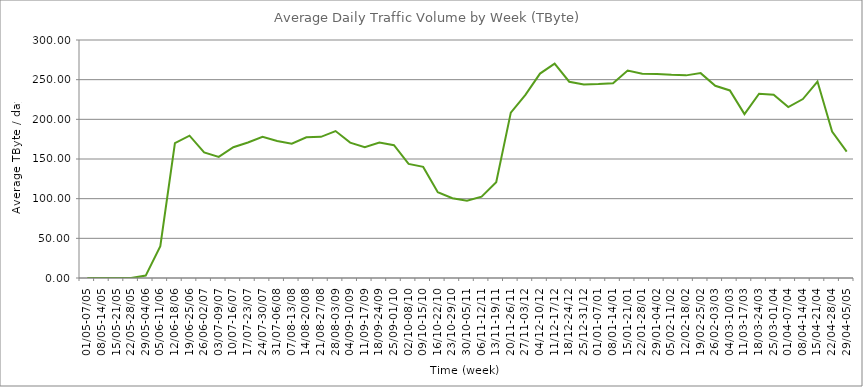
| Category | Average |
|---|---|
| 01/05-07/05 | 0 |
| 08/05-14/05 | 0 |
| 15/05-21/05 | 0 |
| 22/05-28/05 | 0 |
| 29/05-04/06 | 3.02 |
| 05/06-11/06 | 40.1 |
| 12/06-18/06 | 169.9 |
| 19/06-25/06 | 179.39 |
| 26/06-02/07 | 158.25 |
| 03/07-09/07 | 152.69 |
| 10/07-16/07 | 164.8 |
| 17/07-23/07 | 170.84 |
| 24/07-30/07 | 177.87 |
| 31/07-06/08 | 172.74 |
| 07/08-13/08 | 169.21 |
| 14/08-20/08 | 177.45 |
| 21/08-27/08 | 177.91 |
| 28/08-03/09 | 185.2 |
| 04/09-10/09 | 170.67 |
| 11/09-17/09 | 164.86 |
| 18/09-24/09 | 170.86 |
| 25/09-01/10 | 167.42 |
| 02/10-08/10 | 143.87 |
| 09/10-15/10 | 140.06 |
| 16/10-22/10 | 108.03 |
| 23/10-29/10 | 100.51 |
| 30/10-05/11 | 97.45 |
| 06/11-12/11 | 102.54 |
| 13/11-19/11 | 120.68 |
| 20/11-26/11 | 208.46 |
| 27/11-03/12 | 230.77 |
| 04/12-10/12 | 257.68 |
| 11/12-17/12 | 270.17 |
| 18/12-24/12 | 247.38 |
| 25/12-31/12 | 243.85 |
| 01/01-07/01 | 244.45 |
| 08/01-14/01 | 245.53 |
| 15/01-21/01 | 261.46 |
| 22/01-28/01 | 257.34 |
| 29/01-04/02 | 257.26 |
| 05/02-11/02 | 256.06 |
| 12/02-18/02 | 255.42 |
| 19/02-25/02 | 258.24 |
| 26/02-03/03 | 242.29 |
| 04/03-10/03 | 236.39 |
| 11/03-17/03 | 206.59 |
| 18/03-24/03 | 232.35 |
| 25/03-01/04 | 230.94 |
| 01/04-07/04 | 215.39 |
| 08/04-14/04 | 225.54 |
| 15/04-21/04 | 247.65 |
| 22/04-28/04 | 184.53 |
| 29/04-05/05 | 159.4 |